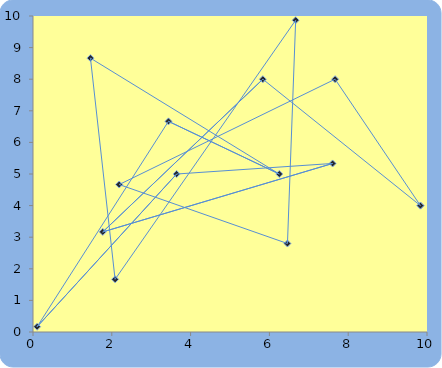
| Category | Series 0 |
|---|---|
| 9.833333333333334 | 4 |
| 7.666666666666666 | 8 |
| 2.1875 | 4.667 |
| 6.458333333333334 | 2.8 |
| 6.666666666666666 | 9.867 |
| 2.0833333333333335 | 1.667 |
| 1.4583333333333335 | 8.667 |
| 6.25 | 5 |
| 3.4375 | 6.667 |
| 0.10416666666666666 | 0.167 |
| 3.645833333333333 | 5 |
| 7.604166666666666 | 5.333 |
| 1.7708333333333335 | 3.167 |
| 5.833333333333334 | 8 |
| 9.833333333333334 | 4 |